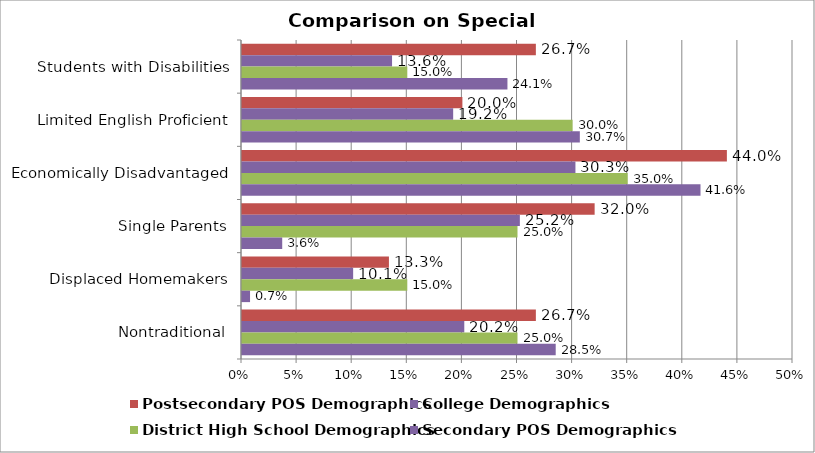
| Category | Postsecondary POS Demographics | College Demographics | District High School Demographics | Secondary POS Demographics |
|---|---|---|---|---|
| Students with Disabilities | 0.267 | 0.136 | 0.15 | 0.241 |
| Limited English Proficient | 0.2 | 0.192 | 0.3 | 0.307 |
| Economically Disadvantaged | 0.44 | 0.303 | 0.35 | 0.416 |
| Single Parents | 0.32 | 0.252 | 0.25 | 0.036 |
| Displaced Homemakers | 0.133 | 0.101 | 0.15 | 0.007 |
| Nontraditional | 0.267 | 0.202 | 0.25 | 0.285 |